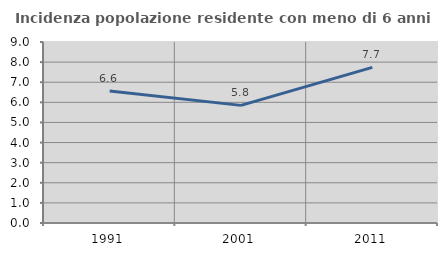
| Category | Incidenza popolazione residente con meno di 6 anni |
|---|---|
| 1991.0 | 6.569 |
| 2001.0 | 5.849 |
| 2011.0 | 7.739 |